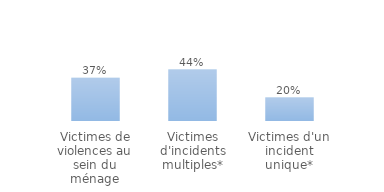
| Category | au moins une démarche |
|---|---|
| Victimes de violences au sein du ménage | 0.37 |
| Victimes d'incidents multiples* | 0.44 |
| Victimes d'un incident unique* | 0.2 |